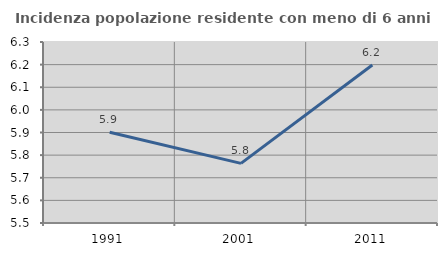
| Category | Incidenza popolazione residente con meno di 6 anni |
|---|---|
| 1991.0 | 5.901 |
| 2001.0 | 5.763 |
| 2011.0 | 6.198 |